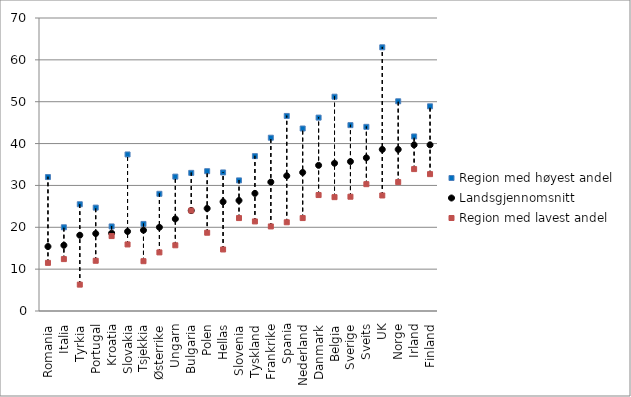
| Category | Region med høyest andel | Landsgjennomsnitt | Region med lavest andel |
|---|---|---|---|
| Romania | 32 | 15.4 | 11.5 |
| Italia | 20 | 15.7 | 12.4 |
| Tyrkia | 25.5 | 18.1 | 6.3 |
| Portugal | 24.7 | 18.5 | 12 |
| Kroatia | 20.2 | 18.6 | 17.9 |
| Slovakia | 37.4 | 19 | 15.9 |
| Tsjekkia | 20.8 | 19.3 | 11.9 |
| Østerrike | 28 | 20 | 14 |
| Ungarn | 32.1 | 22 | 15.7 |
| Bulgaria | 33 | 24 | 24 |
| Polen | 33.4 | 24.5 | 18.7 |
| Hellas | 33.1 | 26.1 | 14.7 |
| Slovenia | 31.2 | 26.4 | 22.2 |
| Tyskland | 37 | 28.1 | 21.4 |
| Frankrike | 41.4 | 30.8 | 20.2 |
| Spania | 46.6 | 32.3 | 21.2 |
| Nederland | 43.6 | 33.1 | 22.2 |
| Danmark | 46.2 | 34.8 | 27.7 |
| Belgia | 51.2 | 35.3 | 27.2 |
| Sverige | 44.4 | 35.7 | 27.3 |
| Sveits | 44 | 36.6 | 30.3 |
| UK | 63 | 38.6 | 27.6 |
| Norge | 50.1 | 38.6 | 30.8 |
| Irland | 41.7 | 39.7 | 33.9 |
| Finland | 48.9 | 39.7 | 32.7 |